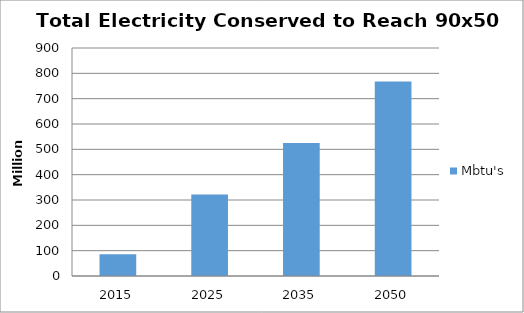
| Category | Mbtu's |
|---|---|
| 2015.0 | 86.189 |
| 2025.0 | 321.249 |
| 2035.0 | 524.968 |
| 2050.0 | 767.864 |